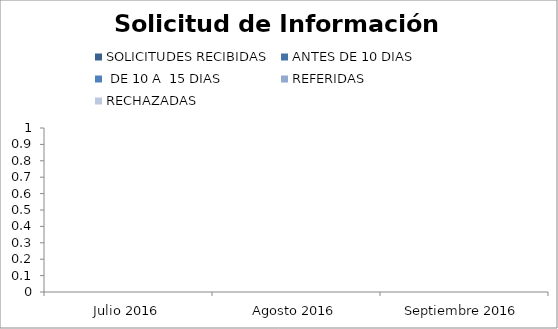
| Category | SOLICITUDES RECIBIDAS | ANTES DE 10 DIAS |  DE 10 A  15 DIAS  | REFERIDAS | RECHAZADAS |
|---|---|---|---|---|---|
| Julio 2016 | 0 | 0 | 0 | 0 | 0 |
| Agosto 2016 | 0 | 0 | 0 | 0 | 0 |
| Septiembre 2016 | 0 | 0 | 0 | 0 | 0 |